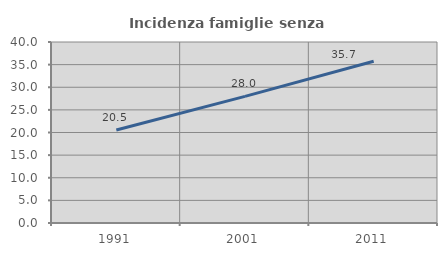
| Category | Incidenza famiglie senza nuclei |
|---|---|
| 1991.0 | 20.538 |
| 2001.0 | 27.978 |
| 2011.0 | 35.733 |